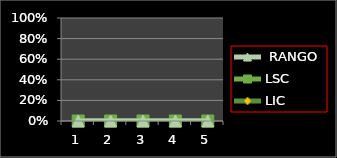
| Category | LIC | LSC |  RANGO |
|---|---|---|---|
| 0 |  | 0 | 0 |
| 1 |  | 0 | 0 |
| 2 |  | 0 | 0 |
| 3 |  | 0 | 0 |
| 4 |  | 0 | 0 |